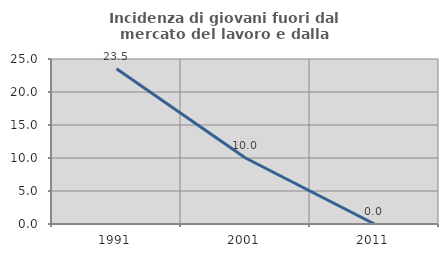
| Category | Incidenza di giovani fuori dal mercato del lavoro e dalla formazione  |
|---|---|
| 1991.0 | 23.529 |
| 2001.0 | 10 |
| 2011.0 | 0 |